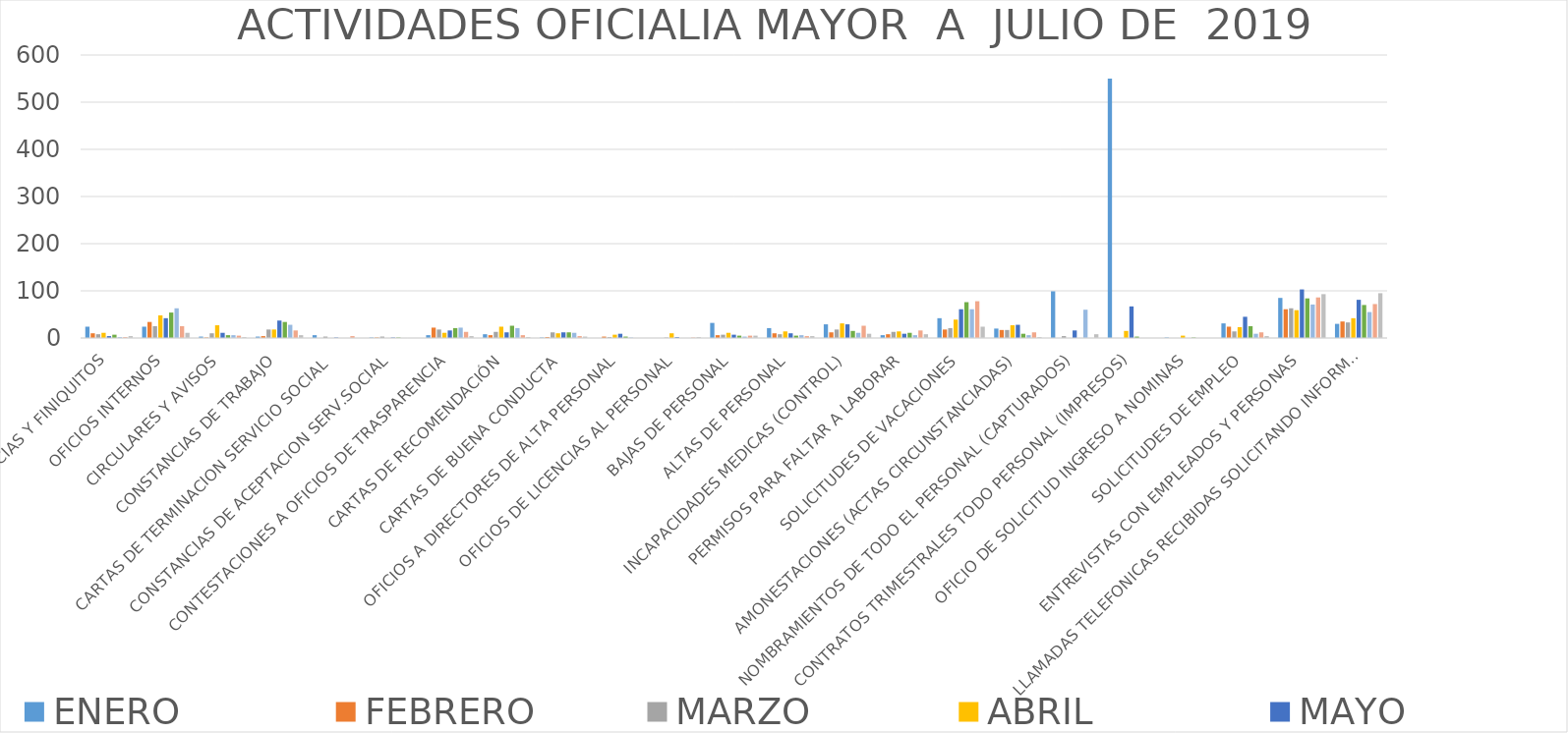
| Category | ENERO | FEBRERO | MARZO | ABRIL | MAYO | JUNIO | JULIO | AGOSTO | SEPTIEMBRE |
|---|---|---|---|---|---|---|---|---|---|
| RENUNCIAS Y FINIQUITOS | 24 | 10 | 8 | 11 | 4 | 7 | 2 | 2 | 4 |
| OFICIOS INTERNOS | 24 | 34 | 25 | 48 | 42 | 54 | 63 | 25 | 11 |
| CIRCULARES Y AVISOS | 3 | 1 | 10 | 27 | 11 | 6 | 6 | 5 | 2 |
| CONSTANCIAS DE TRABAJO | 3 | 4 | 18 | 18 | 37 | 34 | 28 | 16 | 6 |
| CARTAS DE TERMINACION SERVICIO SOCIAL  | 6 | 0 | 3 | 0 | 1 | 0 | 0 | 4 | 0 |
| CONSTANCIAS DE ACEPTACION SERV.SOCIAL | 1 | 1 | 3 | 0 | 1 | 1 | 0 | 0 | 0 |
| CONTESTACIONES A OFICIOS DE TRASPARENCIA | 6 | 22 | 18 | 11 | 16 | 21 | 22 | 13 | 4 |
| CARTAS DE RECOMENDACIÓN | 8 | 6 | 13 | 24 | 12 | 26 | 21 | 6 | 2 |
| CARTAS DE BUENA CONDUCTA | 1 | 2 | 12 | 10 | 12 | 12 | 11 | 4 | 3 |
| OFICIOS A DIRECTORES DE ALTA PERSONAL | 0 | 3 | 2 | 7 | 9 | 3 | 1 | 0 | 0 |
| OFICIOS DE LICENCIAS AL PERSONAL | 0 | 0 | 1 | 10 | 2 | 0 | 0 | 1 | 2 |
| BAJAS DE PERSONAL | 32 | 6 | 7 | 11 | 7 | 5 | 3 | 5 | 5 |
| ALTAS DE PERSONAL | 21 | 10 | 8 | 14 | 10 | 5 | 6 | 4 | 4 |
| INCAPACIDADES MEDICAS (CONTROL) | 29 | 12 | 18 | 31 | 29 | 15 | 11 | 26 | 9 |
| PERMISOS PARA FALTAR A LABORAR | 6 | 8 | 13 | 14 | 9 | 11 | 6 | 16 | 8 |
| SOLICITUDES DE VACACIONES | 42 | 18 | 21 | 39 | 61 | 76 | 61 | 78 | 24 |
| AMONESTACIONES (ACTAS CIRCUNSTANCIADAS) | 20 | 17 | 17 | 27 | 28 | 9 | 6 | 12 | 2 |
| NOMBRAMIENTOS DE TODO EL PERSONAL (CAPTURADOS) | 99 | 0 | 4 | 0 | 16 | 0 | 60 | 0 | 8 |
| CONTRATOS TRIMESTRALES TODO PERSONAL (IMPRESOS) | 550 | 0 | 0 | 15 | 67 | 3 | 0 | 0 | 0 |
| OFICIO DE SOLICITUD INGRESO A NOMINAS | 1 | 0 | 0 | 5 | 0 | 1 | 0 | 0 | 0 |
| SOLICITUDES DE EMPLEO | 31 | 24 | 14 | 23 | 45 | 25 | 9 | 12 | 4 |
| ENTREVISTAS CON EMPLEADOS Y PERSONAS | 85 | 61 | 63 | 59 | 103 | 84 | 71 | 86 | 93 |
|  LLAMADAS TELEFONICAS RECIBIDAS SOLICITANDO INFORMACIONES VARIAS | 30 | 35 | 33 | 42 | 81 | 70 | 55 | 72 | 95 |